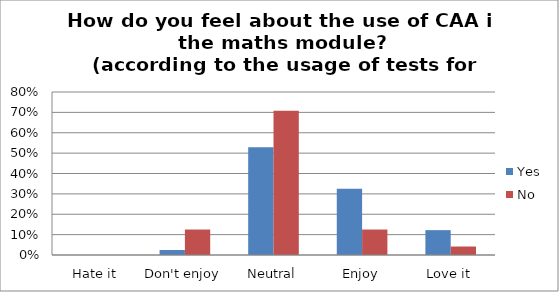
| Category | Yes | No |
|---|---|---|
| Hate it | 0 | 0 |
| Don't enjoy | 0.024 | 0.125 |
| Neutral | 0.528 | 0.708 |
| Enjoy | 0.325 | 0.125 |
| Love it | 0.122 | 0.042 |